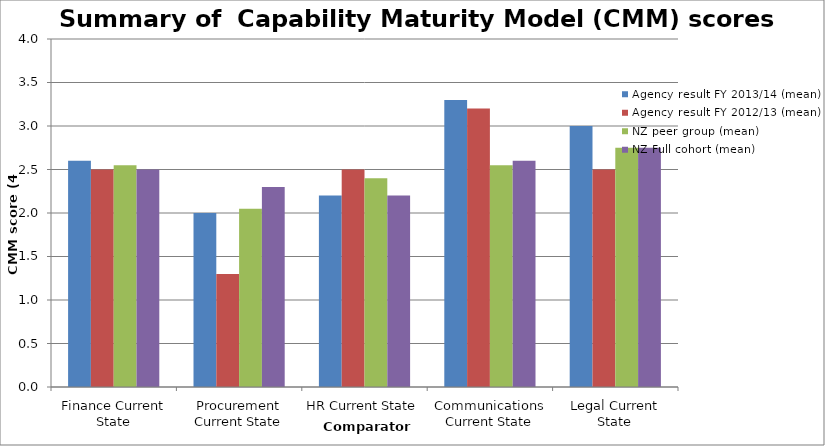
| Category | Agency result FY 2013/14 (mean) | Agency result FY 2012/13 (mean) | NZ peer group (mean) | NZ Full cohort (mean) |
|---|---|---|---|---|
| Finance Current State | 2.6 | 2.5 | 2.55 | 2.5 |
| Procurement Current State | 2 | 1.3 | 2.05 | 2.3 |
| HR Current State | 2.2 | 2.5 | 2.4 | 2.2 |
| Communications Current State | 3.3 | 3.2 | 2.55 | 2.6 |
| Legal Current State | 3 | 2.5 | 2.75 | 2.75 |